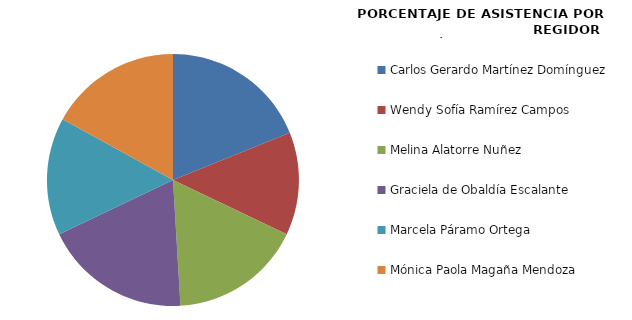
| Category | Series 0 |
|---|---|
| Carlos Gerardo Martínez Domínguez  | 100 |
| Wendy Sofía Ramírez Campos | 70 |
| Melina Alatorre Nuñez | 90 |
| Graciela de Obaldía Escalante | 100 |
| Marcela Páramo Ortega | 80 |
| Mónica Paola Magaña Mendoza | 90 |